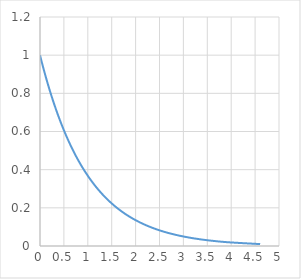
| Category | Series 0 |
|---|---|
| 4.605170185988091 | 0.01 |
| 3.912023005428146 | 0.02 |
| 3.506557897319982 | 0.03 |
| 3.2188758248682006 | 0.04 |
| 2.995732273553991 | 0.05 |
| 2.8134107167600364 | 0.06 |
| 2.659260036932778 | 0.07 |
| 2.5257286443082556 | 0.08 |
| 2.4079456086518722 | 0.09 |
| 2.3025850929940455 | 0.1 |
| 2.2072749131897207 | 0.11 |
| 2.120263536200091 | 0.12 |
| 2.0402208285265546 | 0.13 |
| 1.9661128563728327 | 0.14 |
| 1.8971199848858813 | 0.15 |
| 1.8325814637483102 | 0.16 |
| 1.7719568419318752 | 0.17 |
| 1.7147984280919266 | 0.18 |
| 1.6607312068216509 | 0.19 |
| 1.6094379124341003 | 0.2 |
| 1.5606477482646683 | 0.21 |
| 1.5141277326297755 | 0.22 |
| 1.4696759700589417 | 0.23 |
| 1.4271163556401458 | 0.24 |
| 1.3862943611198906 | 0.25 |
| 1.3470736479666092 | 0.26 |
| 1.3093333199837622 | 0.27 |
| 1.2729656758128873 | 0.28 |
| 1.2378743560016174 | 0.29 |
| 1.2039728043259361 | 0.3 |
| 1.171182981502945 | 0.31 |
| 1.1394342831883648 | 0.32 |
| 1.1086626245216111 | 0.33 |
| 1.0788096613719298 | 0.34 |
| 1.0498221244986778 | 0.35 |
| 1.0216512475319814 | 0.36 |
| 0.9942522733438669 | 0.37 |
| 0.9675840262617056 | 0.38 |
| 0.941608539858445 | 0.39 |
| 0.916290731874155 | 0.4 |
| 0.8915981192837836 | 0.41 |
| 0.8675005677047231 | 0.42 |
| 0.843970070294529 | 0.43 |
| 0.8209805520698302 | 0.44 |
| 0.7985076962177716 | 0.45 |
| 0.7765287894989963 | 0.46 |
| 0.7550225842780328 | 0.47 |
| 0.7339691750802004 | 0.48 |
| 0.7133498878774648 | 0.49 |
| 0.6931471805599453 | 0.5 |
| 0.6733445532637656 | 0.51 |
| 0.6539264674066639 | 0.52 |
| 0.6348782724359695 | 0.53 |
| 0.616186139423817 | 0.54 |
| 0.5978370007556204 | 0.55 |
| 0.579818495252942 | 0.56 |
| 0.5621189181535413 | 0.57 |
| 0.5447271754416722 | 0.58 |
| 0.527632742082372 | 0.59 |
| 0.5108256237659907 | 0.6 |
| 0.4942963218147801 | 0.61 |
| 0.4780358009429998 | 0.62 |
| 0.4620354595965587 | 0.63 |
| 0.4462871026284195 | 0.64 |
| 0.4307829160924542 | 0.65 |
| 0.4155154439616658 | 0.66 |
| 0.40047756659712525 | 0.67 |
| 0.3856624808119846 | 0.68 |
| 0.37106368139083207 | 0.69 |
| 0.35667494393873245 | 0.7 |
| 0.342490308946776 | 0.71 |
| 0.3285040669720361 | 0.72 |
| 0.31471074483970024 | 0.73 |
| 0.3011050927839216 | 0.74 |
| 0.2876820724517809 | 0.75 |
| 0.2744368457017603 | 0.76 |
| 0.2613647641344075 | 0.77 |
| 0.2484613592984996 | 0.78 |
| 0.23572233352106983 | 0.79 |
| 0.2231435513142097 | 0.8 |
| 0.21072103131565253 | 0.81 |
| 0.19845093872383832 | 0.82 |
| 0.18632957819149348 | 0.83 |
| 0.1743533871447778 | 0.84 |
| 0.16251892949777494 | 0.85 |
| 0.15082288973458366 | 0.86 |
| 0.13926206733350766 | 0.87 |
| 0.12783337150988489 | 0.88 |
| 0.11653381625595151 | 0.89 |
| 0.10536051565782628 | 0.9 |
| 0.09431067947124129 | 0.91 |
| 0.08338160893905101 | 0.92 |
| 0.07257069283483537 | 0.93 |
| 0.06187540371808753 | 0.94 |
| 0.05129329438755058 | 0.95 |
| 0.040821994520255166 | 0.96 |
| 0.030459207484708574 | 0.97 |
| 0.020202707317519466 | 0.98 |
| 0.01005033585350145 | 0.99 |
| 0.0 | 1 |